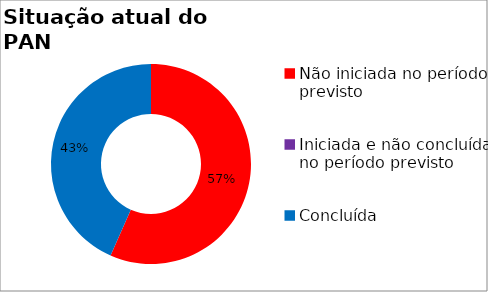
| Category | Series 0 |
|---|---|
| Não iniciada no período previsto | 0.566 |
| Iniciada e não concluída no período previsto | 0 |
| Concluída | 0.434 |